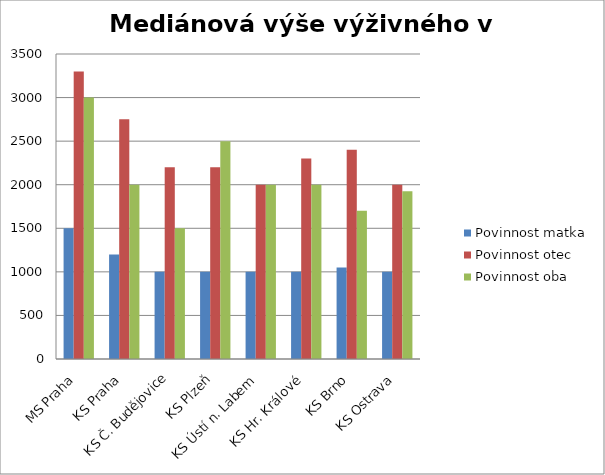
| Category | Povinnost matka | Povinnost otec | Povinnost oba |
|---|---|---|---|
| MS Praha | 1500 | 3300 | 3000 |
| KS Praha | 1200 | 2750 | 2000 |
| KS Č. Budějovice | 1000 | 2200 | 1500 |
| KS Plzeň | 1000 | 2200 | 2500 |
| KS Ústí n. Labem | 1000 | 2000 | 2000 |
| KS Hr. Králové | 1000 | 2300 | 2000 |
| KS Brno | 1050 | 2400 | 1700 |
| KS Ostrava | 1000 | 2000 | 1925 |